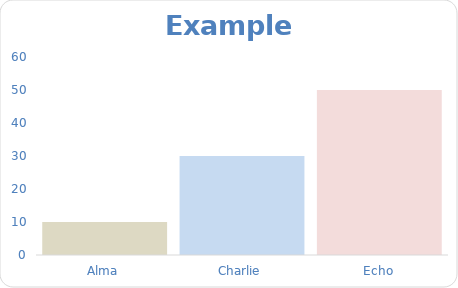
| Category | "Dynamic Chart Example" |
|---|---|
| Alma | 10 |
| Charlie | 30 |
| Echo | 50 |